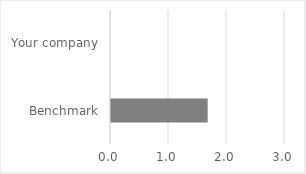
| Category | Understanding of basic SC information |
|---|---|
| Benchmark | 1.667 |
| Your company | 0 |